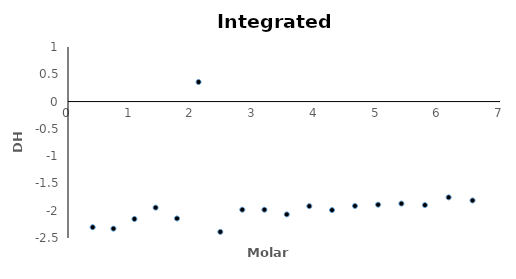
| Category | Series 0 |
|---|---|
| 0.399995 | -2.303 |
| 0.736802 | -2.328 |
| 1.076766 | -2.151 |
| 1.419889 | -1.943 |
| 1.76617 | -2.142 |
| 2.115609 | 0.358 |
| 2.468206 | -2.388 |
| 2.823961 | -1.982 |
| 3.182875 | -1.982 |
| 3.544947 | -2.068 |
| 3.910177 | -1.916 |
| 4.278566 | -1.988 |
| 4.650112 | -1.913 |
| 5.024817 | -1.89 |
| 5.40268 | -1.87 |
| 5.783701 | -1.897 |
| 6.16788 | -1.755 |
| 6.555218 | -1.812 |